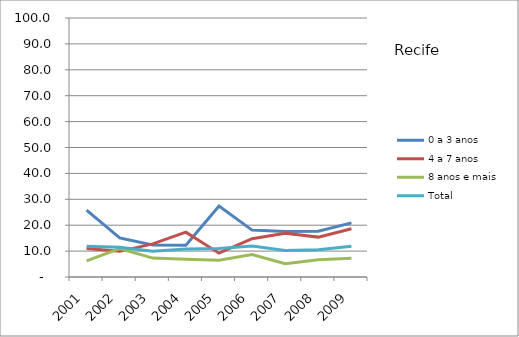
| Category | 0 a 3 anos | 4 a 7 anos | 8 anos e mais | Total |
|---|---|---|---|---|
| 2001.0 | 25.8 | 11 | 6.2 | 11.9 |
| 2002.0 | 15.1 | 9.9 | 11 | 11.5 |
| 2003.0 | 12.4 | 12.8 | 7.3 | 9.9 |
| 2004.0 | 12.3 | 17.3 | 6.9 | 10.8 |
| 2005.0 | 27.4 | 9.2 | 6.5 | 11 |
| 2006.0 | 18.1 | 14.8 | 8.7 | 12 |
| 2007.0 | 17.6 | 16.9 | 5.1 | 10.2 |
| 2008.0 | 17.7 | 15.4 | 6.7 | 10.5 |
| 2009.0 | 20.9 | 18.6 | 7.2 | 11.9 |